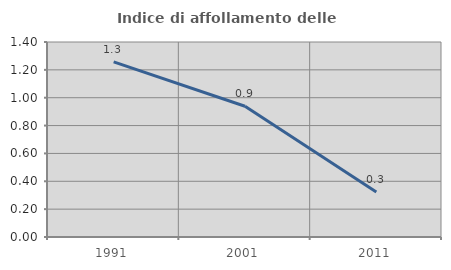
| Category | Indice di affollamento delle abitazioni  |
|---|---|
| 1991.0 | 1.257 |
| 2001.0 | 0.938 |
| 2011.0 | 0.323 |